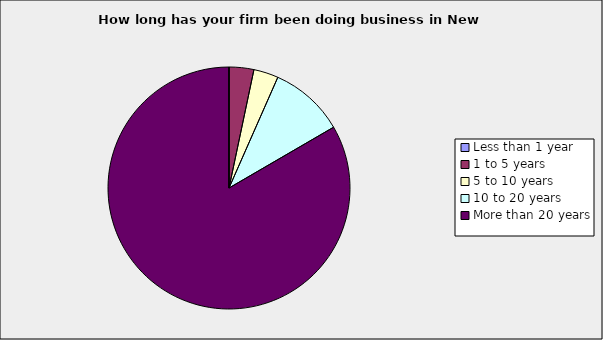
| Category | Series 0 |
|---|---|
| Less than 1 year | 0 |
| 1 to 5 years | 0.033 |
| 5 to 10 years | 0.033 |
| 10 to 20 years | 0.1 |
| More than 20 years | 0.833 |